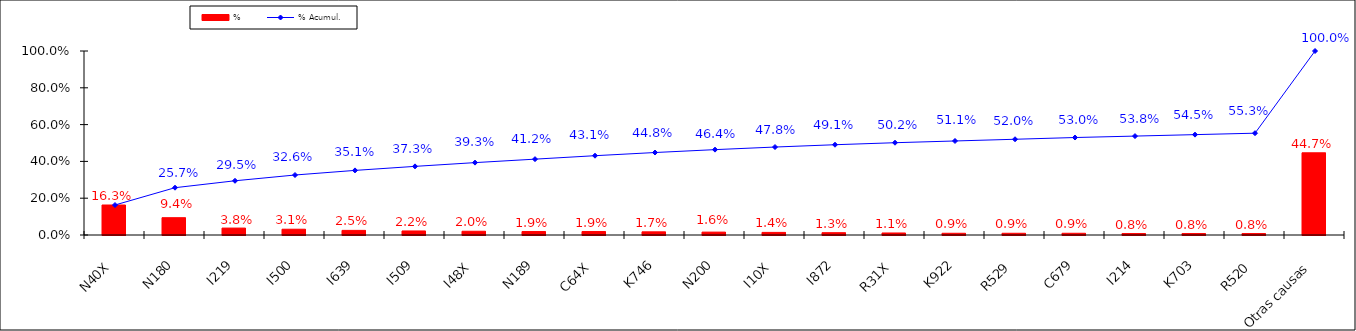
| Category | % |
|---|---|
| N40X | 0.163 |
| N180 | 0.094 |
| I219 | 0.038 |
| I500 | 0.031 |
| I639 | 0.025 |
| I509 | 0.022 |
| I48X | 0.02 |
| N189 | 0.019 |
| C64X | 0.019 |
| K746 | 0.017 |
| N200 | 0.016 |
| I10X | 0.014 |
| I872 | 0.013 |
| R31X | 0.011 |
| K922 | 0.009 |
| R529 | 0.009 |
| C679 | 0.009 |
| I214 | 0.008 |
| K703 | 0.008 |
| R520 | 0.008 |
| Otras causas | 0.447 |